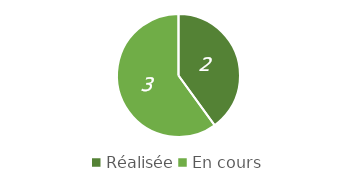
| Category | Series 0 |
|---|---|
| Réalisée | 2 |
| En cours | 3 |